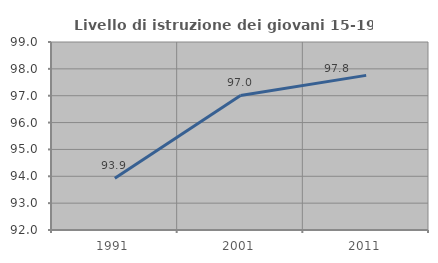
| Category | Livello di istruzione dei giovani 15-19 anni |
|---|---|
| 1991.0 | 93.923 |
| 2001.0 | 97.009 |
| 2011.0 | 97.758 |